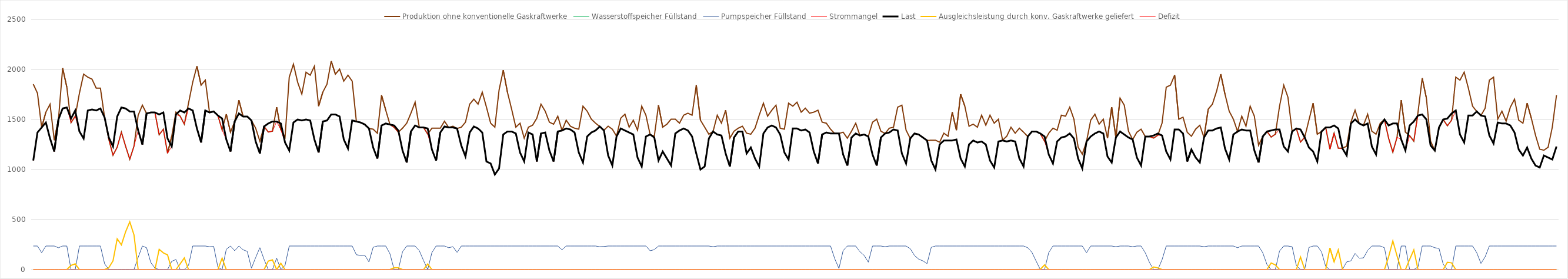
| Category | Produktion ohne konventionelle Gaskraftwerke | Wasserstoffspeicher Füllstand | Pumpspeicher Füllstand | Strommangel | Last | Ausgleichsleistung durch konv. Gaskraftwerke geliefert | Defizit |
|---|---|---|---|---|---|---|---|
| 1/1/19 | 1852.934 | 0 | 235.44 | 1090 | 1090 | 0 | 0 |
| 1/2/19 | 1762.934 | 0 | 235.44 | 1370 | 1370 | 0 | 0 |
| 1/3/19 | 1420 | 0 | 168.374 | 1420 | 1420 | 0 | 0 |
| 1/4/19 | 1572.934 | 0 | 235.44 | 1470 | 1470 | 0 | 0 |
| 1/5/19 | 1652.934 | 0 | 235.44 | 1310 | 1310 | 0 | 0 |
| 1/6/19 | 1292.934 | 0 | 235.44 | 1180 | 1180 | 0 | 0 |
| 1/7/19 | 1500 | 0 | 218.374 | 1500 | 1500 | 0 | 0 |
| 1/8/19 | 2012.934 | 0 | 235.44 | 1610 | 1610 | 0 | 0 |
| 1/9/19 | 1822.934 | 0 | 235.44 | 1620 | 1620 | 0 | 0 |
| 1/10/19 | 1468.374 | 0 | 0 | 1468.374 | 1510 | 41.626 | 0 |
| 1/11/19 | 1532.934 | 0 | 0 | 1532.934 | 1590 | 57.066 | 0 |
| 1/12/19 | 1762.934 | 0 | 235.44 | 1380 | 1380 | 0 | 0 |
| 1/13/19 | 1952.934 | 0 | 235.44 | 1310 | 1310 | 0 | 0 |
| 1/14/19 | 1922.934 | 0 | 235.44 | 1590 | 1590 | 0 | 0 |
| 1/15/19 | 1902.934 | 0 | 235.44 | 1600 | 1600 | 0 | 0 |
| 1/16/19 | 1812.934 | 0 | 235.44 | 1590 | 1590 | 0 | 0 |
| 1/17/19 | 1812.934 | 0 | 235.44 | 1610 | 1610 | 0 | 0 |
| 1/18/19 | 1520 | 0 | 58.374 | 1520 | 1520 | 0 | 0 |
| 1/19/19 | 1301.309 | 0 | 0 | 1301.309 | 1320 | 18.691 | 0 |
| 1/20/19 | 1142.934 | 0 | 0 | 1142.934 | 1230 | 87.066 | 0 |
| 1/21/19 | 1222.934 | 0 | 0 | 1222.934 | 1530 | 307.066 | 0 |
| 1/22/19 | 1372.934 | 0 | 0 | 1372.934 | 1620 | 247.066 | 0 |
| 1/23/19 | 1232.934 | 0 | 0 | 1232.934 | 1610 | 377.066 | 0 |
| 1/24/19 | 1102.934 | 0 | 0 | 1102.934 | 1580 | 477.066 | 0 |
| 1/25/19 | 1232.934 | 0 | 0 | 1232.934 | 1580 | 347.066 | 0 |
| 1/26/19 | 1542.934 | 0 | 122.348 | 1390 | 1390 | 0 | 0 |
| 1/27/19 | 1642.934 | 0 | 235.44 | 1250 | 1250 | 0 | 0 |
| 1/28/19 | 1560 | 0 | 218.374 | 1560 | 1560 | 0 | 0 |
| 1/29/19 | 1570 | 0 | 71.309 | 1570 | 1570 | 0 | 0 |
| 1/30/19 | 1570 | 0 | 14.243 | 1570 | 1570 | 0 | 0 |
| 1/31/19 | 1347.178 | 0 | 0 | 1347.178 | 1550 | 202.822 | 0 |
| 2/1/19 | 1402.934 | 0 | 0 | 1402.934 | 1570 | 167.066 | 0 |
| 2/2/19 | 1162.934 | 0 | 0 | 1162.934 | 1310 | 147.066 | 0 |
| 2/3/19 | 1332.934 | 0 | 82.348 | 1230 | 1230 | 0 | 0 |
| 2/4/19 | 1572.934 | 0 | 100.695 | 1550 | 1550 | 0 | 0 |
| 2/5/19 | 1533.629 | 0 | 0 | 1533.629 | 1590 | 56.371 | 0 |
| 2/6/19 | 1452.934 | 0 | 0 | 1452.934 | 1570 | 117.066 | 0 |
| 2/7/19 | 1662.934 | 0 | 42.348 | 1610 | 1610 | 0 | 0 |
| 2/8/19 | 1872.934 | 0 | 235.44 | 1590 | 1590 | 0 | 0 |
| 2/9/19 | 2032.934 | 0 | 235.44 | 1410 | 1410 | 0 | 0 |
| 2/10/19 | 1842.934 | 0 | 235.44 | 1270 | 1270 | 0 | 0 |
| 2/11/19 | 1892.934 | 0 | 235.44 | 1590 | 1590 | 0 | 0 |
| 2/12/19 | 1570 | 0 | 228.374 | 1570 | 1570 | 0 | 0 |
| 2/13/19 | 1582.934 | 0 | 230.722 | 1580 | 1580 | 0 | 0 |
| 2/14/19 | 1540 | 0 | 23.656 | 1540 | 1540 | 0 | 0 |
| 2/15/19 | 1396.591 | 0 | 0 | 1396.591 | 1510 | 113.409 | 0 |
| 2/16/19 | 1552.934 | 0 | 202.348 | 1300 | 1300 | 0 | 0 |
| 2/17/19 | 1372.934 | 0 | 235.44 | 1180 | 1180 | 0 | 0 |
| 2/18/19 | 1480 | 0 | 188.374 | 1480 | 1480 | 0 | 0 |
| 2/19/19 | 1692.934 | 0 | 235.44 | 1560 | 1560 | 0 | 0 |
| 2/20/19 | 1530 | 0 | 198.374 | 1530 | 1530 | 0 | 0 |
| 2/21/19 | 1530 | 0 | 181.309 | 1530 | 1530 | 0 | 0 |
| 2/22/19 | 1490 | 0 | 14.243 | 1490 | 1490 | 0 | 0 |
| 2/23/19 | 1412.934 | 0 | 120.591 | 1280 | 1280 | 0 | 0 |
| 2/24/19 | 1282.934 | 0 | 218.938 | 1160 | 1160 | 0 | 0 |
| 2/25/19 | 1430 | 0 | 101.873 | 1430 | 1430 | 0 | 0 |
| 2/26/19 | 1374.807 | 0 | 0 | 1374.807 | 1460 | 85.193 | 0 |
| 2/27/19 | 1382.934 | 0 | 0 | 1382.934 | 1480 | 97.066 | 0 |
| 2/28/19 | 1622.934 | 0 | 114.348 | 1480 | 1480 | 0 | 0 |
| 3/1/19 | 1397.282 | 0 | 0 | 1397.282 | 1460 | 62.718 | 0 |
| 3/2/19 | 1322.934 | 0 | 42.348 | 1270 | 1270 | 0 | 0 |
| 3/3/19 | 1922.934 | 0 | 235.44 | 1190 | 1190 | 0 | 0 |
| 3/4/19 | 2052.934 | 0 | 235.44 | 1470 | 1470 | 0 | 0 |
| 3/5/19 | 1872.934 | 0 | 235.44 | 1500 | 1500 | 0 | 0 |
| 3/6/19 | 1752.934 | 0 | 235.44 | 1490 | 1490 | 0 | 0 |
| 3/7/19 | 1972.934 | 0 | 235.44 | 1500 | 1500 | 0 | 0 |
| 3/8/19 | 1942.934 | 0 | 235.44 | 1490 | 1490 | 0 | 0 |
| 3/9/19 | 2032.934 | 0 | 235.44 | 1300 | 1300 | 0 | 0 |
| 3/10/19 | 1632.934 | 0 | 235.44 | 1170 | 1170 | 0 | 0 |
| 3/11/19 | 1772.934 | 0 | 235.44 | 1480 | 1480 | 0 | 0 |
| 3/12/19 | 1852.934 | 0 | 235.44 | 1490 | 1490 | 0 | 0 |
| 3/13/19 | 2082.934 | 0 | 235.44 | 1550 | 1550 | 0 | 0 |
| 3/14/19 | 1952.934 | 0 | 235.44 | 1550 | 1550 | 0 | 0 |
| 3/15/19 | 2002.934 | 0 | 235.44 | 1530 | 1530 | 0 | 0 |
| 3/16/19 | 1882.934 | 0 | 235.44 | 1300 | 1300 | 0 | 0 |
| 3/17/19 | 1942.934 | 0 | 235.44 | 1210 | 1210 | 0 | 0 |
| 3/18/19 | 1882.934 | 0 | 235.44 | 1490 | 1490 | 0 | 0 |
| 3/19/19 | 1480 | 0 | 148.374 | 1480 | 1480 | 0 | 0 |
| 3/20/19 | 1470 | 0 | 141.309 | 1470 | 1470 | 0 | 0 |
| 3/21/19 | 1452.934 | 0 | 143.656 | 1450 | 1450 | 0 | 0 |
| 3/22/19 | 1410 | 0 | 76.591 | 1410 | 1410 | 0 | 0 |
| 3/23/19 | 1402.934 | 0 | 222.938 | 1220 | 1220 | 0 | 0 |
| 3/24/19 | 1362.934 | 0 | 235.44 | 1110 | 1110 | 0 | 0 |
| 3/25/19 | 1742.934 | 0 | 235.44 | 1440 | 1440 | 0 | 0 |
| 3/26/19 | 1592.934 | 0 | 235.44 | 1460 | 1460 | 0 | 0 |
| 3/27/19 | 1450 | 0 | 158.374 | 1450 | 1450 | 0 | 0 |
| 3/28/19 | 1421.309 | 0 | 0 | 1421.309 | 1440 | 18.691 | 0 |
| 3/29/19 | 1372.934 | 0 | 0 | 1372.934 | 1390 | 17.066 | 0 |
| 3/30/19 | 1412.934 | 0 | 178.348 | 1190 | 1190 | 0 | 0 |
| 3/31/19 | 1462.934 | 0 | 235.44 | 1070 | 1070 | 0 | 0 |
| 4/1/19 | 1562.934 | 0 | 235.44 | 1380 | 1380 | 0 | 0 |
| 4/2/19 | 1672.934 | 0 | 235.44 | 1440 | 1440 | 0 | 0 |
| 4/3/19 | 1420 | 0 | 188.374 | 1420 | 1420 | 0 | 0 |
| 4/4/19 | 1420 | 0 | 91.309 | 1420 | 1420 | 0 | 0 |
| 4/5/19 | 1354.243 | 0 | 0 | 1354.243 | 1410 | 55.757 | 0 |
| 4/6/19 | 1412.934 | 0 | 170.348 | 1200 | 1200 | 0 | 0 |
| 4/7/19 | 1412.934 | 0 | 235.44 | 1090 | 1090 | 0 | 0 |
| 4/8/19 | 1412.934 | 0 | 235.44 | 1370 | 1370 | 0 | 0 |
| 4/9/19 | 1482.934 | 0 | 235.44 | 1430 | 1430 | 0 | 0 |
| 4/10/19 | 1420 | 0 | 218.374 | 1420 | 1420 | 0 | 0 |
| 4/11/19 | 1432.934 | 0 | 228.722 | 1420 | 1420 | 0 | 0 |
| 4/12/19 | 1410 | 0 | 171.656 | 1410 | 1410 | 0 | 0 |
| 4/13/19 | 1422.934 | 0 | 235.44 | 1240 | 1240 | 0 | 0 |
| 4/14/19 | 1472.934 | 0 | 235.44 | 1130 | 1130 | 0 | 0 |
| 4/15/19 | 1652.934 | 0 | 235.44 | 1370 | 1370 | 0 | 0 |
| 4/16/19 | 1702.934 | 0 | 235.44 | 1430 | 1430 | 0 | 0 |
| 4/17/19 | 1652.934 | 0 | 235.44 | 1410 | 1410 | 0 | 0 |
| 4/18/19 | 1772.934 | 0 | 235.44 | 1370 | 1370 | 0 | 0 |
| 4/19/19 | 1622.934 | 0 | 235.44 | 1080 | 1080 | 0 | 0 |
| 4/20/19 | 1462.934 | 0 | 235.44 | 1060 | 1060 | 0 | 0 |
| 4/21/19 | 1422.934 | 0 | 235.44 | 950 | 950 | 0 | 0 |
| 4/22/19 | 1792.934 | 0 | 235.44 | 1010 | 1010 | 0 | 0 |
| 4/23/19 | 1992.934 | 0 | 235.44 | 1350 | 1350 | 0 | 0 |
| 4/24/19 | 1772.934 | 0 | 235.44 | 1380 | 1380 | 0 | 0 |
| 4/25/19 | 1602.934 | 0 | 235.44 | 1380 | 1380 | 0 | 0 |
| 4/26/19 | 1422.934 | 0 | 235.44 | 1360 | 1360 | 0 | 0 |
| 4/27/19 | 1462.934 | 0 | 235.44 | 1170 | 1170 | 0 | 0 |
| 4/28/19 | 1312.934 | 0 | 235.44 | 1080 | 1080 | 0 | 0 |
| 4/29/19 | 1422.934 | 0 | 235.44 | 1370 | 1370 | 0 | 0 |
| 4/30/19 | 1442.934 | 0 | 235.44 | 1350 | 1350 | 0 | 0 |
| 5/1/19 | 1512.934 | 0 | 235.44 | 1080 | 1080 | 0 | 0 |
| 5/2/19 | 1652.934 | 0 | 235.44 | 1360 | 1360 | 0 | 0 |
| 5/3/19 | 1582.934 | 0 | 235.44 | 1370 | 1370 | 0 | 0 |
| 5/4/19 | 1472.934 | 0 | 235.44 | 1190 | 1190 | 0 | 0 |
| 5/5/19 | 1452.934 | 0 | 235.44 | 1080 | 1080 | 0 | 0 |
| 5/6/19 | 1532.934 | 0 | 235.44 | 1380 | 1380 | 0 | 0 |
| 5/7/19 | 1390 | 0 | 198.374 | 1390 | 1390 | 0 | 0 |
| 5/8/19 | 1492.934 | 0 | 235.44 | 1410 | 1410 | 0 | 0 |
| 5/9/19 | 1432.934 | 0 | 235.44 | 1400 | 1400 | 0 | 0 |
| 5/10/19 | 1412.934 | 0 | 235.44 | 1370 | 1370 | 0 | 0 |
| 5/11/19 | 1402.934 | 0 | 235.44 | 1170 | 1170 | 0 | 0 |
| 5/12/19 | 1632.934 | 0 | 235.44 | 1070 | 1070 | 0 | 0 |
| 5/13/19 | 1582.934 | 0 | 235.44 | 1330 | 1330 | 0 | 0 |
| 5/14/19 | 1502.934 | 0 | 235.44 | 1370 | 1370 | 0 | 0 |
| 5/15/19 | 1462.934 | 0 | 235.44 | 1390 | 1390 | 0 | 0 |
| 5/16/19 | 1430 | 0 | 228.374 | 1430 | 1430 | 0 | 0 |
| 5/17/19 | 1392.934 | 0 | 230.722 | 1390 | 1390 | 0 | 0 |
| 5/18/19 | 1432.934 | 0 | 235.44 | 1140 | 1140 | 0 | 0 |
| 5/19/19 | 1402.934 | 0 | 235.44 | 1040 | 1040 | 0 | 0 |
| 5/20/19 | 1332.934 | 0 | 235.44 | 1330 | 1330 | 0 | 0 |
| 5/21/19 | 1512.934 | 0 | 235.44 | 1410 | 1410 | 0 | 0 |
| 5/22/19 | 1552.934 | 0 | 235.44 | 1390 | 1390 | 0 | 0 |
| 5/23/19 | 1422.934 | 0 | 235.44 | 1370 | 1370 | 0 | 0 |
| 5/24/19 | 1492.934 | 0 | 235.44 | 1350 | 1350 | 0 | 0 |
| 5/25/19 | 1392.934 | 0 | 235.44 | 1120 | 1120 | 0 | 0 |
| 5/26/19 | 1632.934 | 0 | 235.44 | 1030 | 1030 | 0 | 0 |
| 5/27/19 | 1542.934 | 0 | 235.44 | 1330 | 1330 | 0 | 0 |
| 5/28/19 | 1350 | 0 | 188.374 | 1350 | 1350 | 0 | 0 |
| 5/29/19 | 1332.934 | 0 | 198.722 | 1320 | 1320 | 0 | 0 |
| 5/30/19 | 1642.934 | 0 | 235.44 | 1090 | 1090 | 0 | 0 |
| 5/31/19 | 1422.934 | 0 | 235.44 | 1180 | 1180 | 0 | 0 |
| 6/1/19 | 1452.934 | 0 | 235.44 | 1110 | 1110 | 0 | 0 |
| 6/2/19 | 1502.934 | 0 | 235.44 | 1040 | 1040 | 0 | 0 |
| 6/3/19 | 1502.934 | 0 | 235.44 | 1360 | 1360 | 0 | 0 |
| 6/4/19 | 1462.934 | 0 | 235.44 | 1390 | 1390 | 0 | 0 |
| 6/5/19 | 1542.934 | 0 | 235.44 | 1410 | 1410 | 0 | 0 |
| 6/6/19 | 1562.934 | 0 | 235.44 | 1390 | 1390 | 0 | 0 |
| 6/7/19 | 1542.934 | 0 | 235.44 | 1330 | 1330 | 0 | 0 |
| 6/8/19 | 1842.934 | 0 | 235.44 | 1160 | 1160 | 0 | 0 |
| 6/9/19 | 1492.934 | 0 | 235.44 | 1000 | 1000 | 0 | 0 |
| 6/10/19 | 1422.934 | 0 | 235.44 | 1030 | 1030 | 0 | 0 |
| 6/11/19 | 1352.934 | 0 | 235.44 | 1310 | 1310 | 0 | 0 |
| 6/12/19 | 1380 | 0 | 228.374 | 1380 | 1380 | 0 | 0 |
| 6/13/19 | 1542.934 | 0 | 235.44 | 1350 | 1350 | 0 | 0 |
| 6/14/19 | 1462.934 | 0 | 235.44 | 1340 | 1340 | 0 | 0 |
| 6/15/19 | 1592.934 | 0 | 235.44 | 1160 | 1160 | 0 | 0 |
| 6/16/19 | 1312.934 | 0 | 235.44 | 1030 | 1030 | 0 | 0 |
| 6/17/19 | 1382.934 | 0 | 235.44 | 1320 | 1320 | 0 | 0 |
| 6/18/19 | 1412.934 | 0 | 235.44 | 1380 | 1380 | 0 | 0 |
| 6/19/19 | 1432.934 | 0 | 235.44 | 1380 | 1380 | 0 | 0 |
| 6/20/19 | 1362.934 | 0 | 235.44 | 1160 | 1160 | 0 | 0 |
| 6/21/19 | 1352.934 | 0 | 235.44 | 1220 | 1220 | 0 | 0 |
| 6/22/19 | 1412.934 | 0 | 235.44 | 1110 | 1110 | 0 | 0 |
| 6/23/19 | 1542.934 | 0 | 235.44 | 1030 | 1030 | 0 | 0 |
| 6/24/19 | 1662.934 | 0 | 235.44 | 1360 | 1360 | 0 | 0 |
| 6/25/19 | 1532.934 | 0 | 235.44 | 1420 | 1420 | 0 | 0 |
| 6/26/19 | 1592.934 | 0 | 235.44 | 1440 | 1440 | 0 | 0 |
| 6/27/19 | 1642.934 | 0 | 235.44 | 1420 | 1420 | 0 | 0 |
| 6/28/19 | 1412.934 | 0 | 235.44 | 1350 | 1350 | 0 | 0 |
| 6/29/19 | 1402.934 | 0 | 235.44 | 1170 | 1170 | 0 | 0 |
| 6/30/19 | 1662.934 | 0 | 235.44 | 1100 | 1100 | 0 | 0 |
| 7/1/19 | 1632.934 | 0 | 235.44 | 1410 | 1410 | 0 | 0 |
| 7/2/19 | 1672.934 | 0 | 235.44 | 1410 | 1410 | 0 | 0 |
| 7/3/19 | 1572.934 | 0 | 235.44 | 1390 | 1390 | 0 | 0 |
| 7/4/19 | 1612.934 | 0 | 235.44 | 1400 | 1400 | 0 | 0 |
| 7/5/19 | 1562.934 | 0 | 235.44 | 1370 | 1370 | 0 | 0 |
| 7/6/19 | 1572.934 | 0 | 235.44 | 1180 | 1180 | 0 | 0 |
| 7/7/19 | 1592.934 | 0 | 235.44 | 1060 | 1060 | 0 | 0 |
| 7/8/19 | 1472.934 | 0 | 235.44 | 1350 | 1350 | 0 | 0 |
| 7/9/19 | 1462.934 | 0 | 235.44 | 1370 | 1370 | 0 | 0 |
| 7/10/19 | 1402.934 | 0 | 235.44 | 1360 | 1360 | 0 | 0 |
| 7/11/19 | 1360 | 0 | 108.374 | 1360 | 1360 | 0 | 0 |
| 7/12/19 | 1360 | 0 | 11.309 | 1360 | 1360 | 0 | 0 |
| 7/13/19 | 1372.934 | 0 | 189.656 | 1150 | 1150 | 0 | 0 |
| 7/14/19 | 1312.934 | 0 | 235.44 | 1040 | 1040 | 0 | 0 |
| 7/15/19 | 1382.934 | 0 | 235.44 | 1320 | 1320 | 0 | 0 |
| 7/16/19 | 1462.934 | 0 | 235.44 | 1360 | 1360 | 0 | 0 |
| 7/17/19 | 1340 | 0 | 178.374 | 1340 | 1340 | 0 | 0 |
| 7/18/19 | 1350 | 0 | 141.309 | 1350 | 1350 | 0 | 0 |
| 7/19/19 | 1330 | 0 | 74.243 | 1330 | 1330 | 0 | 0 |
| 7/20/19 | 1472.934 | 0 | 235.44 | 1150 | 1150 | 0 | 0 |
| 7/21/19 | 1502.934 | 0 | 235.44 | 1040 | 1040 | 0 | 0 |
| 7/22/19 | 1382.934 | 0 | 235.44 | 1320 | 1320 | 0 | 0 |
| 7/23/19 | 1360 | 0 | 228.374 | 1360 | 1360 | 0 | 0 |
| 7/24/19 | 1412.934 | 0 | 235.44 | 1370 | 1370 | 0 | 0 |
| 7/25/19 | 1422.934 | 0 | 235.44 | 1400 | 1400 | 0 | 0 |
| 7/26/19 | 1622.934 | 0 | 235.44 | 1390 | 1390 | 0 | 0 |
| 7/27/19 | 1642.934 | 0 | 235.44 | 1160 | 1160 | 0 | 0 |
| 7/28/19 | 1392.934 | 0 | 235.44 | 1060 | 1060 | 0 | 0 |
| 7/29/19 | 1310 | 0 | 208.374 | 1310 | 1310 | 0 | 0 |
| 7/30/19 | 1360 | 0 | 141.309 | 1360 | 1360 | 0 | 0 |
| 7/31/19 | 1350 | 0 | 104.243 | 1350 | 1350 | 0 | 0 |
| 8/1/19 | 1320 | 0 | 87.178 | 1320 | 1320 | 0 | 0 |
| 8/2/19 | 1290 | 0 | 60.112 | 1290 | 1290 | 0 | 0 |
| 8/3/19 | 1292.934 | 0 | 222.46 | 1090 | 1090 | 0 | 0 |
| 8/4/19 | 1292.934 | 0 | 235.44 | 1000 | 1000 | 0 | 0 |
| 8/5/19 | 1272.934 | 0 | 235.44 | 1250 | 1250 | 0 | 0 |
| 8/6/19 | 1362.934 | 0 | 235.44 | 1290 | 1290 | 0 | 0 |
| 8/7/19 | 1332.934 | 0 | 235.44 | 1290 | 1290 | 0 | 0 |
| 8/8/19 | 1572.934 | 0 | 235.44 | 1290 | 1290 | 0 | 0 |
| 8/9/19 | 1392.934 | 0 | 235.44 | 1300 | 1300 | 0 | 0 |
| 8/10/19 | 1752.934 | 0 | 235.44 | 1110 | 1110 | 0 | 0 |
| 8/11/19 | 1632.934 | 0 | 235.44 | 1030 | 1030 | 0 | 0 |
| 8/12/19 | 1432.934 | 0 | 235.44 | 1250 | 1250 | 0 | 0 |
| 8/13/19 | 1452.934 | 0 | 235.44 | 1290 | 1290 | 0 | 0 |
| 8/14/19 | 1422.934 | 0 | 235.44 | 1270 | 1270 | 0 | 0 |
| 8/15/19 | 1542.934 | 0 | 235.44 | 1280 | 1280 | 0 | 0 |
| 8/16/19 | 1442.934 | 0 | 235.44 | 1250 | 1250 | 0 | 0 |
| 8/17/19 | 1542.934 | 0 | 235.44 | 1090 | 1090 | 0 | 0 |
| 8/18/19 | 1462.934 | 0 | 235.44 | 1020 | 1020 | 0 | 0 |
| 8/19/19 | 1502.934 | 0 | 235.44 | 1280 | 1280 | 0 | 0 |
| 8/20/19 | 1292.934 | 0 | 235.44 | 1290 | 1290 | 0 | 0 |
| 8/21/19 | 1332.934 | 0 | 235.44 | 1280 | 1280 | 0 | 0 |
| 8/22/19 | 1422.934 | 0 | 235.44 | 1290 | 1290 | 0 | 0 |
| 8/23/19 | 1362.934 | 0 | 235.44 | 1280 | 1280 | 0 | 0 |
| 8/24/19 | 1412.934 | 0 | 235.44 | 1110 | 1110 | 0 | 0 |
| 8/25/19 | 1372.934 | 0 | 235.44 | 1030 | 1030 | 0 | 0 |
| 8/26/19 | 1330 | 0 | 218.374 | 1330 | 1330 | 0 | 0 |
| 8/27/19 | 1380 | 0 | 171.309 | 1380 | 1380 | 0 | 0 |
| 8/28/19 | 1380 | 0 | 84.243 | 1380 | 1380 | 0 | 0 |
| 8/29/19 | 1357.178 | 0 | 0 | 1357.178 | 1360 | 2.822 | 0 |
| 8/30/19 | 1282.934 | 0 | 0 | 1282.934 | 1330 | 47.066 | 0 |
| 8/31/19 | 1362.934 | 0 | 170.348 | 1150 | 1150 | 0 | 0 |
| 9/1/19 | 1412.934 | 0 | 235.44 | 1060 | 1060 | 0 | 0 |
| 9/2/19 | 1392.934 | 0 | 235.44 | 1280 | 1280 | 0 | 0 |
| 9/3/19 | 1542.934 | 0 | 235.44 | 1320 | 1320 | 0 | 0 |
| 9/4/19 | 1532.934 | 0 | 235.44 | 1330 | 1330 | 0 | 0 |
| 9/5/19 | 1622.934 | 0 | 235.44 | 1360 | 1360 | 0 | 0 |
| 9/6/19 | 1502.934 | 0 | 235.44 | 1310 | 1310 | 0 | 0 |
| 9/7/19 | 1222.934 | 0 | 235.44 | 1110 | 1110 | 0 | 0 |
| 9/8/19 | 1152.934 | 0 | 235.44 | 1010 | 1010 | 0 | 0 |
| 9/9/19 | 1280 | 0 | 168.374 | 1280 | 1280 | 0 | 0 |
| 9/10/19 | 1492.934 | 0 | 235.44 | 1330 | 1330 | 0 | 0 |
| 9/11/19 | 1552.934 | 0 | 235.44 | 1360 | 1360 | 0 | 0 |
| 9/12/19 | 1452.934 | 0 | 235.44 | 1380 | 1380 | 0 | 0 |
| 9/13/19 | 1502.934 | 0 | 235.44 | 1360 | 1360 | 0 | 0 |
| 9/14/19 | 1312.934 | 0 | 235.44 | 1130 | 1130 | 0 | 0 |
| 9/15/19 | 1622.934 | 0 | 235.44 | 1070 | 1070 | 0 | 0 |
| 9/16/19 | 1320 | 0 | 228.374 | 1320 | 1320 | 0 | 0 |
| 9/17/19 | 1712.934 | 0 | 235.44 | 1380 | 1380 | 0 | 0 |
| 9/18/19 | 1642.934 | 0 | 235.44 | 1350 | 1350 | 0 | 0 |
| 9/19/19 | 1382.934 | 0 | 235.44 | 1320 | 1320 | 0 | 0 |
| 9/20/19 | 1300 | 0 | 228.374 | 1300 | 1300 | 0 | 0 |
| 9/21/19 | 1372.934 | 0 | 235.44 | 1120 | 1120 | 0 | 0 |
| 9/22/19 | 1402.934 | 0 | 235.44 | 1040 | 1040 | 0 | 0 |
| 9/23/19 | 1330 | 0 | 168.374 | 1330 | 1330 | 0 | 0 |
| 9/24/19 | 1330 | 0 | 71.309 | 1330 | 1330 | 0 | 0 |
| 9/25/19 | 1314.243 | 0 | 0 | 1314.243 | 1340 | 25.757 | 0 |
| 9/26/19 | 1342.934 | 0 | 0 | 1342.934 | 1360 | 17.066 | 0 |
| 9/27/19 | 1462.934 | 0 | 98.348 | 1340 | 1340 | 0 | 0 |
| 9/28/19 | 1822.934 | 0 | 235.44 | 1180 | 1180 | 0 | 0 |
| 9/29/19 | 1842.934 | 0 | 235.44 | 1100 | 1100 | 0 | 0 |
| 9/30/19 | 1942.934 | 0 | 235.44 | 1400 | 1400 | 0 | 0 |
| 10/1/19 | 1502.934 | 0 | 235.44 | 1400 | 1400 | 0 | 0 |
| 10/2/19 | 1522.934 | 0 | 235.44 | 1360 | 1360 | 0 | 0 |
| 10/3/19 | 1372.934 | 0 | 235.44 | 1080 | 1080 | 0 | 0 |
| 10/4/19 | 1332.934 | 0 | 235.44 | 1200 | 1200 | 0 | 0 |
| 10/5/19 | 1402.934 | 0 | 235.44 | 1120 | 1120 | 0 | 0 |
| 10/6/19 | 1442.934 | 0 | 235.44 | 1070 | 1070 | 0 | 0 |
| 10/7/19 | 1320 | 0 | 228.374 | 1320 | 1320 | 0 | 0 |
| 10/8/19 | 1602.934 | 0 | 235.44 | 1390 | 1390 | 0 | 0 |
| 10/9/19 | 1652.934 | 0 | 235.44 | 1390 | 1390 | 0 | 0 |
| 10/10/19 | 1782.934 | 0 | 235.44 | 1410 | 1410 | 0 | 0 |
| 10/11/19 | 1952.934 | 0 | 235.44 | 1420 | 1420 | 0 | 0 |
| 10/12/19 | 1752.934 | 0 | 235.44 | 1210 | 1210 | 0 | 0 |
| 10/13/19 | 1582.934 | 0 | 235.44 | 1100 | 1100 | 0 | 0 |
| 10/14/19 | 1502.934 | 0 | 235.44 | 1350 | 1350 | 0 | 0 |
| 10/15/19 | 1380 | 0 | 218.374 | 1380 | 1380 | 0 | 0 |
| 10/16/19 | 1532.934 | 0 | 235.44 | 1400 | 1400 | 0 | 0 |
| 10/17/19 | 1432.934 | 0 | 235.44 | 1390 | 1390 | 0 | 0 |
| 10/18/19 | 1632.934 | 0 | 235.44 | 1390 | 1390 | 0 | 0 |
| 10/19/19 | 1532.934 | 0 | 235.44 | 1190 | 1190 | 0 | 0 |
| 10/20/19 | 1242.934 | 0 | 235.44 | 1070 | 1070 | 0 | 0 |
| 10/21/19 | 1330 | 0 | 168.374 | 1330 | 1330 | 0 | 0 |
| 10/22/19 | 1380 | 0 | 51.309 | 1380 | 1380 | 0 | 0 |
| 10/23/19 | 1324.243 | 0 | 0 | 1324.243 | 1390 | 65.757 | 0 |
| 10/24/19 | 1352.934 | 0 | 0 | 1352.934 | 1400 | 47.066 | 0 |
| 10/25/19 | 1632.934 | 0 | 186.348 | 1400 | 1400 | 0 | 0 |
| 10/26/19 | 1842.934 | 0 | 235.44 | 1230 | 1230 | 0 | 0 |
| 10/27/19 | 1722.934 | 0 | 235.44 | 1180 | 1180 | 0 | 0 |
| 10/28/19 | 1380 | 0 | 228.374 | 1380 | 1380 | 0 | 0 |
| 10/29/19 | 1410 | 0 | 41.309 | 1410 | 1410 | 0 | 0 |
| 10/30/19 | 1274.243 | 0 | 0 | 1274.243 | 1400 | 125.757 | 0 |
| 10/31/19 | 1322.934 | 0 | 2.348 | 1320 | 1320 | 0 | 0 |
| 11/1/19 | 1492.934 | 0 | 220.695 | 1220 | 1220 | 0 | 0 |
| 11/2/19 | 1662.934 | 0 | 235.44 | 1180 | 1180 | 0 | 0 |
| 11/3/19 | 1352.934 | 0 | 235.44 | 1080 | 1080 | 0 | 0 |
| 11/4/19 | 1380 | 0 | 178.374 | 1380 | 1380 | 0 | 0 |
| 11/5/19 | 1420 | 0 | 31.309 | 1420 | 1420 | 0 | 0 |
| 11/6/19 | 1204.243 | 0 | 0 | 1204.243 | 1420 | 215.757 | 0 |
| 11/7/19 | 1362.934 | 0 | 0 | 1362.934 | 1440 | 77.066 | 0 |
| 11/8/19 | 1212.934 | 0 | 0 | 1212.934 | 1410 | 197.066 | 0 |
| 11/9/19 | 1212.934 | 0 | 2.348 | 1210 | 1210 | 0 | 0 |
| 11/10/19 | 1232.934 | 0 | 76.695 | 1140 | 1140 | 0 | 0 |
| 11/11/19 | 1472.934 | 0 | 87.043 | 1460 | 1460 | 0 | 0 |
| 11/12/19 | 1592.934 | 0 | 161.39 | 1500 | 1500 | 0 | 0 |
| 11/13/19 | 1460 | 0 | 114.324 | 1460 | 1460 | 0 | 0 |
| 11/14/19 | 1442.934 | 0 | 116.672 | 1440 | 1440 | 0 | 0 |
| 11/15/19 | 1552.934 | 0 | 191.02 | 1460 | 1460 | 0 | 0 |
| 11/16/19 | 1382.934 | 0 | 235.44 | 1230 | 1230 | 0 | 0 |
| 11/17/19 | 1352.934 | 0 | 235.44 | 1150 | 1150 | 0 | 0 |
| 11/18/19 | 1462.934 | 0 | 235.44 | 1440 | 1440 | 0 | 0 |
| 11/19/19 | 1500 | 0 | 218.374 | 1500 | 1500 | 0 | 0 |
| 11/20/19 | 1311.309 | 0 | 0 | 1311.309 | 1440 | 128.691 | 0 |
| 11/21/19 | 1172.934 | 0 | 0 | 1172.934 | 1460 | 287.066 | 0 |
| 11/22/19 | 1322.934 | 0 | 0 | 1322.934 | 1460 | 137.066 | 0 |
| 11/23/19 | 1692.934 | 0 | 235.44 | 1300 | 1300 | 0 | 0 |
| 11/24/19 | 1372.934 | 0 | 235.44 | 1190 | 1190 | 0 | 0 |
| 11/25/19 | 1338.374 | 0 | 0 | 1338.374 | 1440 | 101.626 | 0 |
| 11/26/19 | 1282.934 | 0 | 0 | 1282.934 | 1480 | 197.066 | 0 |
| 11/27/19 | 1572.934 | 0 | 26.348 | 1540 | 1540 | 0 | 0 |
| 11/28/19 | 1912.934 | 0 | 235.44 | 1550 | 1550 | 0 | 0 |
| 11/29/19 | 1712.934 | 0 | 235.44 | 1500 | 1500 | 0 | 0 |
| 11/30/19 | 1282.934 | 0 | 235.44 | 1240 | 1240 | 0 | 0 |
| 12/1/19 | 1190 | 0 | 218.374 | 1190 | 1190 | 0 | 0 |
| 12/2/19 | 1420 | 0 | 211.309 | 1420 | 1420 | 0 | 0 |
| 12/3/19 | 1500 | 0 | 54.243 | 1500 | 1500 | 0 | 0 |
| 12/4/19 | 1437.178 | 0 | 0 | 1437.178 | 1510 | 72.822 | 0 |
| 12/5/19 | 1492.934 | 0 | 0 | 1492.934 | 1560 | 67.066 | 0 |
| 12/6/19 | 1922.934 | 0 | 235.44 | 1590 | 1590 | 0 | 0 |
| 12/7/19 | 1892.934 | 0 | 235.44 | 1350 | 1350 | 0 | 0 |
| 12/8/19 | 1972.934 | 0 | 235.44 | 1270 | 1270 | 0 | 0 |
| 12/9/19 | 1812.934 | 0 | 235.44 | 1540 | 1540 | 0 | 0 |
| 12/10/19 | 1632.934 | 0 | 235.44 | 1540 | 1540 | 0 | 0 |
| 12/11/19 | 1580 | 0 | 168.374 | 1580 | 1580 | 0 | 0 |
| 12/12/19 | 1540 | 0 | 61.309 | 1540 | 1540 | 0 | 0 |
| 12/13/19 | 1612.934 | 0 | 127.656 | 1530 | 1530 | 0 | 0 |
| 12/14/19 | 1892.934 | 0 | 235.44 | 1340 | 1340 | 0 | 0 |
| 12/15/19 | 1922.934 | 0 | 235.44 | 1260 | 1260 | 0 | 0 |
| 12/16/19 | 1502.934 | 0 | 235.44 | 1470 | 1470 | 0 | 0 |
| 12/17/19 | 1582.934 | 0 | 235.44 | 1460 | 1460 | 0 | 0 |
| 12/18/19 | 1482.934 | 0 | 235.44 | 1460 | 1460 | 0 | 0 |
| 12/19/19 | 1622.934 | 0 | 235.44 | 1440 | 1440 | 0 | 0 |
| 12/20/19 | 1702.934 | 0 | 235.44 | 1370 | 1370 | 0 | 0 |
| 12/21/19 | 1492.934 | 0 | 235.44 | 1200 | 1200 | 0 | 0 |
| 12/22/19 | 1462.934 | 0 | 235.44 | 1140 | 1140 | 0 | 0 |
| 12/23/19 | 1662.934 | 0 | 235.44 | 1220 | 1220 | 0 | 0 |
| 12/24/19 | 1512.934 | 0 | 235.44 | 1110 | 1110 | 0 | 0 |
| 12/25/19 | 1342.934 | 0 | 235.44 | 1040 | 1040 | 0 | 0 |
| 12/26/19 | 1202.934 | 0 | 235.44 | 1020 | 1020 | 0 | 0 |
| 12/27/19 | 1192.934 | 0 | 235.44 | 1140 | 1140 | 0 | 0 |
| 12/28/19 | 1222.934 | 0 | 235.44 | 1120 | 1120 | 0 | 0 |
| 12/29/19 | 1422.934 | 0 | 235.44 | 1100 | 1100 | 0 | 0 |
| 12/30/19 | 1742.934 | 0 | 235.44 | 1230 | 1230 | 0 | 0 |